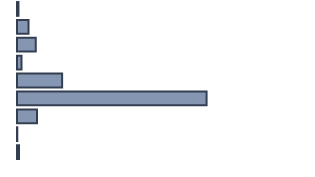
| Category | Percentatge |
|---|---|
| 0 | 0.5 |
| 1 | 3.9 |
| 2 | 6.4 |
| 3 | 1.5 |
| 4 | 15.4 |
| 5 | 64.7 |
| 6 | 6.8 |
| 7 | 0.1 |
| 8 | 0.7 |